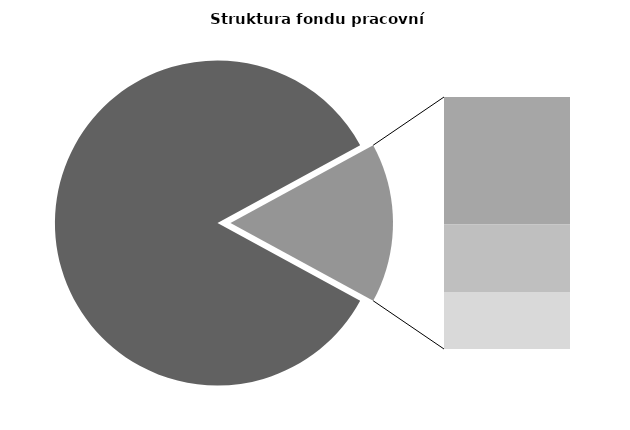
| Category | Series 0 |
|---|---|
| Průměrná měsíční odpracovaná doba bez přesčasu | 143.677 |
| Dovolená | 13.72 |
| Nemoc | 7.284 |
| Jiné | 6.133 |